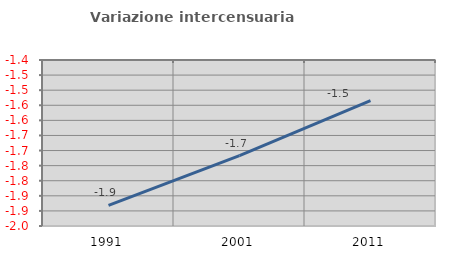
| Category | Variazione intercensuaria annua |
|---|---|
| 1991.0 | -1.882 |
| 2001.0 | -1.717 |
| 2011.0 | -1.535 |